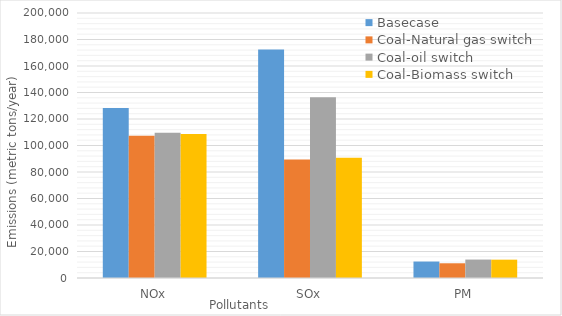
| Category | Basecase | Coal-Natural gas switch | Coal-oil switch | Coal-Biomass switch |
|---|---|---|---|---|
| NOx | 128241.169 | 107349.839 | 109697.179 | 108758 |
| SOx | 172370.01 | 89522.505 | 136347.723 | 90668 |
| PM | 12429.595 | 11116.094 | 13921.124 | 13844 |